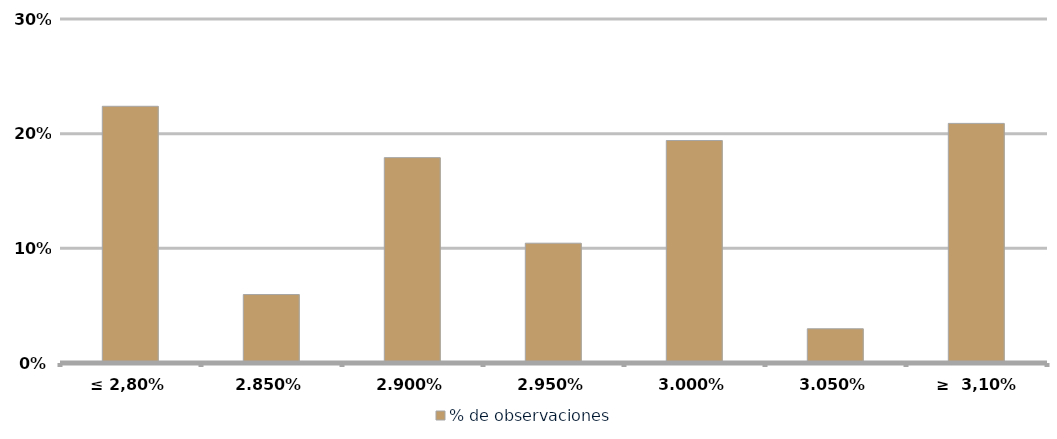
| Category | % de observaciones  |
|---|---|
| ≤ 2,80% | 0.224 |
| 2,85% | 0.06 |
| 2,90% | 0.179 |
| 2,95% | 0.104 |
| 3,00% | 0.194 |
| 3,05% | 0.03 |
| ≥  3,10% | 0.209 |